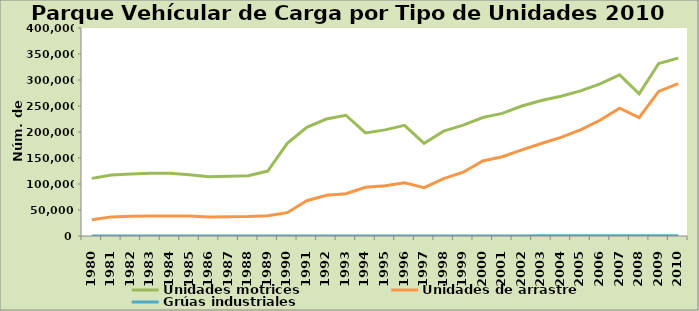
| Category | Unidades motrices | Unidades de arrastre | Grúas industriales |
|---|---|---|---|
| 1980.0 | 110810 | 31120 | 0 |
| 1981.0 | 117090 | 36760 | 0 |
| 1982.0 | 119309 | 38216 | 0 |
| 1983.0 | 120702 | 38639 | 0 |
| 1984.0 | 120702 | 38639 | 0 |
| 1985.0 | 117956 | 38317 | 0 |
| 1986.0 | 114000 | 36500 | 0 |
| 1987.0 | 115092 | 37245 | 0 |
| 1988.0 | 115897 | 37506 | 0 |
| 1989.0 | 124897 | 39113 | 0 |
| 1990.0 | 178130 | 44853 | 0 |
| 1991.0 | 209060 | 67865 | 0 |
| 1992.0 | 224913 | 78233 | 0 |
| 1993.0 | 232203 | 81307 | 0 |
| 1994.0 | 198273 | 93827 | 0 |
| 1995.0 | 204117 | 96638 | 0 |
| 1996.0 | 212909 | 102409 | 0 |
| 1997.0 | 178332 | 92999 | 0 |
| 1998.0 | 201587 | 110530 | 0 |
| 1999.0 | 213292 | 122619 | 126 |
| 2000.0 | 227847 | 144225 | 191 |
| 2001.0 | 235767 | 152341 | 212 |
| 2002.0 | 250025 | 165601 | 221 |
| 2003.0 | 260645 | 177864 | 251 |
| 2004.0 | 268725 | 189568 | 256 |
| 2005.0 | 279112 | 204186 | 266 |
| 2006.0 | 292418 | 222580 | 281 |
| 2007.0 | 310013 | 245843 | 294 |
| 2008.0 | 273455 | 227806 | 277 |
| 2009.0 | 331686 | 278133 | 329 |
| 2010.0 | 342064 | 293053 | 351 |